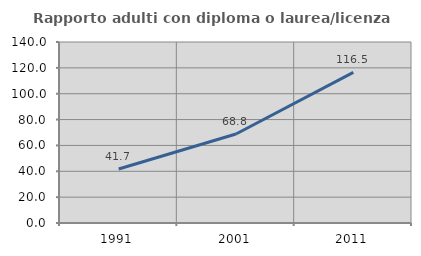
| Category | Rapporto adulti con diploma o laurea/licenza media  |
|---|---|
| 1991.0 | 41.732 |
| 2001.0 | 68.812 |
| 2011.0 | 116.45 |